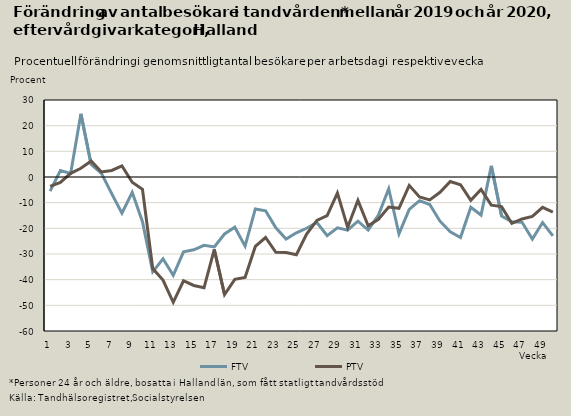
| Category | FTV | PTV |
|---|---|---|
| 0 | -5.517 | -3.687 |
| 1 | 2.48 | -2.09 |
| 2 | 1.402 | 1.434 |
| 3 | 24.609 | 3.379 |
| 4 | 4.871 | 6.266 |
| 5 | 1.415 | 1.985 |
| 6 | -6.455 | 2.536 |
| 7 | -14.081 | 4.32 |
| 8 | -5.962 | -2.058 |
| 9 | -17.393 | -4.771 |
| 10 | -36.938 | -35.664 |
| 11 | -31.866 | -40.169 |
| 12 | -38.305 | -48.819 |
| 13 | -29.179 | -40.418 |
| 14 | -28.355 | -42.255 |
| 15 | -26.602 | -43.182 |
| 16 | -27.247 | -28.234 |
| 17 | -22.201 | -45.797 |
| 18 | -19.585 | -39.883 |
| 19 | -26.935 | -39.17 |
| 20 | -12.447 | -27.06 |
| 21 | -13.173 | -23.574 |
| 22 | -19.814 | -29.324 |
| 23 | -24.184 | -29.444 |
| 24 | -21.746 | -30.286 |
| 25 | -19.978 | -22.269 |
| 26 | -17.729 | -16.9 |
| 27 | -22.851 | -15.043 |
| 28 | -19.814 | -6.242 |
| 29 | -20.722 | -19.622 |
| 30 | -17.202 | -9.087 |
| 31 | -20.667 | -19.031 |
| 32 | -14.815 | -16.494 |
| 33 | -4.57 | -11.696 |
| 34 | -22.176 | -12.21 |
| 35 | -12.623 | -3.262 |
| 36 | -9.23 | -7.795 |
| 37 | -10.709 | -8.907 |
| 38 | -17.219 | -5.974 |
| 39 | -21.371 | -1.734 |
| 40 | -23.611 | -3.003 |
| 41 | -11.759 | -9.084 |
| 42 | -14.807 | -4.837 |
| 43 | 4.318 | -10.967 |
| 44 | -15.216 | -11.545 |
| 45 | -17.431 | -18.087 |
| 46 | -17.661 | -16.336 |
| 47 | -24.189 | -15.343 |
| 48 | -17.753 | -11.807 |
| 49 | -22.956 | -13.652 |